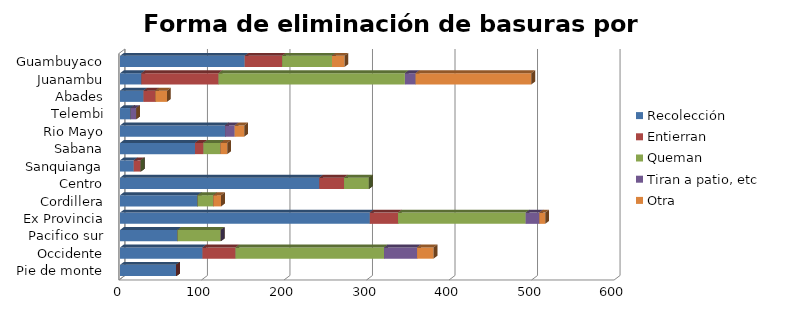
| Category | Recolección | Entierran | Queman | Tiran a patio, etc | Otra |
|---|---|---|---|---|---|
| Pie de monte | 67.98 | 0 | 0 | 0 | 0 |
| Occidente | 99.984 | 39.994 | 179.972 | 39.994 | 19.997 |
| Pacifico sur | 69.714 | 0 | 52.286 | 0 | 0 |
| Ex Provincia | 302.737 | 34.145 | 154.7 | 16.525 | 7.152 |
| Cordillera | 94 | 0 | 19 | 0 | 9.5 |
| Centro | 241.47 | 30 | 30 | 0 | 0 |
| Sanquianga | 16.66 | 8.33 | 0 | 0 | 0 |
| Sabana | 90.882 | 10.256 | 20.513 | 0 | 8.309 |
| Rio Mayo | 127.38 | 0 | 0 | 11.58 | 11.58 |
| Telembi | 13.06 | 0 | 0 | 6.53 | 0 |
| Abades | 28.49 | 14.245 | 0 | 0 | 14.245 |
| Juanambu | 25.889 | 93.501 | 225.835 | 12.945 | 140.251 |
| Guambuyaco | 151.1 | 45.33 | 60.44 | 0 | 15.11 |